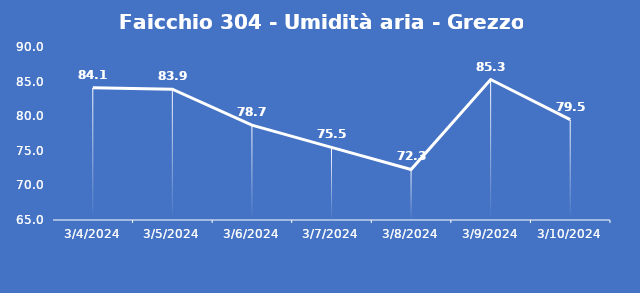
| Category | Faicchio 304 - Umidità aria - Grezzo (%) |
|---|---|
| 3/4/24 | 84.1 |
| 3/5/24 | 83.9 |
| 3/6/24 | 78.7 |
| 3/7/24 | 75.5 |
| 3/8/24 | 72.3 |
| 3/9/24 | 85.3 |
| 3/10/24 | 79.5 |